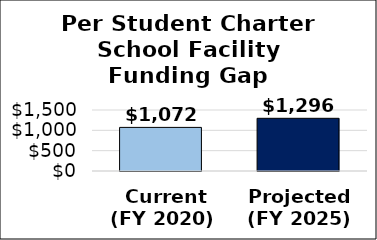
| Category | Facility gap per student |
|---|---|
|  Current
(FY 2020) | 1072.272 |
| Projected
(FY 2025) | 1295.807 |